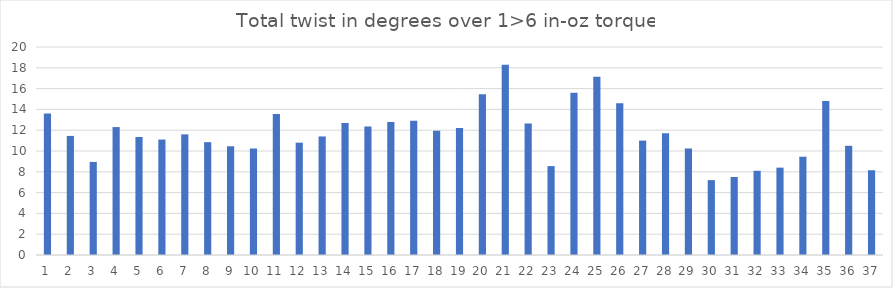
| Category | Series 0 |
|---|---|
| 0 | 13.6 |
| 1 | 11.45 |
| 2 | 8.95 |
| 3 | 12.3 |
| 4 | 11.35 |
| 5 | 11.1 |
| 6 | 11.6 |
| 7 | 10.85 |
| 8 | 10.45 |
| 9 | 10.25 |
| 10 | 13.55 |
| 11 | 10.8 |
| 12 | 11.4 |
| 13 | 12.7 |
| 14 | 12.35 |
| 15 | 12.8 |
| 16 | 12.9 |
| 17 | 11.95 |
| 18 | 12.2 |
| 19 | 15.45 |
| 20 | 18.3 |
| 21 | 12.65 |
| 22 | 8.55 |
| 23 | 15.6 |
| 24 | 17.15 |
| 25 | 14.6 |
| 26 | 11 |
| 27 | 11.7 |
| 28 | 10.25 |
| 29 | 7.2 |
| 30 | 7.5 |
| 31 | 8.1 |
| 32 | 8.4 |
| 33 | 9.45 |
| 34 | 14.8 |
| 35 | 10.5 |
| 36 | 8.15 |